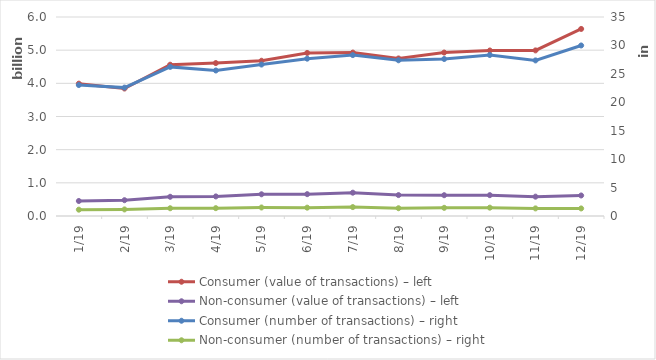
| Category | Consumer (value of transactions) – left | Non-consumer (value of transactions) – left |
|---|---|---|
| 2019-01-01 | 3990525747 | 452381617 |
| 2019-02-01 | 3843805478 | 476334872 |
| 2019-03-01 | 4561252902 | 579447440 |
| 2019-04-01 | 4610847145 | 590033024 |
| 2019-05-01 | 4681006289 | 654819250 |
| 2019-06-01 | 4915978276 | 658443215 |
| 2019-07-01 | 4927410111 | 702956940 |
| 2019-08-01 | 4749938806 | 630507526 |
| 2019-09-01 | 4928258642 | 626709883 |
| 2019-10-01 | 4989967475 | 628399624 |
| 2019-11-01 | 4992991415 | 583238918 |
| 2019-12-01 | 5640314088 | 618836120 |